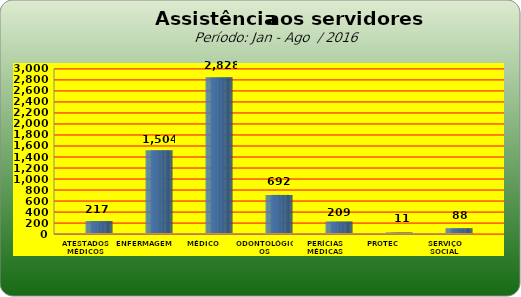
| Category | Series 0 |
|---|---|
| ATESTADOS MÉDICOS | 217 |
| ENFERMAGEM | 1504 |
| MÉDICO | 2828 |
| ODONTOLÓGICOS | 692 |
| PERÍCIAS MÉDICAS | 209 |
| PROTEC | 11 |
| SERVIÇO SOCIAL | 88 |